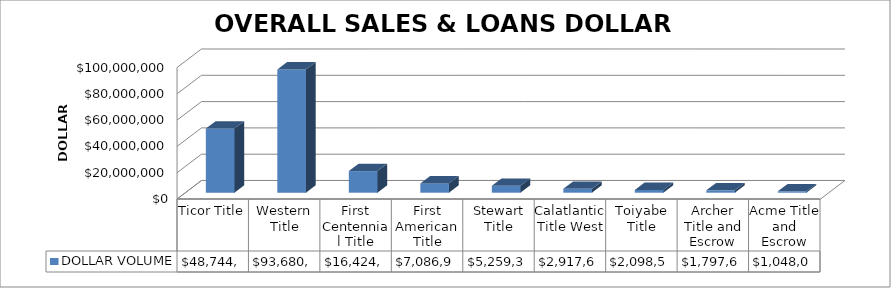
| Category | DOLLAR VOLUME |
|---|---|
| Ticor Title | 48744770 |
| Western Title | 93680867.75 |
| First Centennial Title | 16424570 |
| First American Title | 7086945 |
| Stewart Title | 5259381 |
| Calatlantic Title West | 2917689 |
| Toiyabe Title | 2098500 |
| Archer Title and Escrow | 1797615 |
| Acme Title and Escrow | 1048000 |